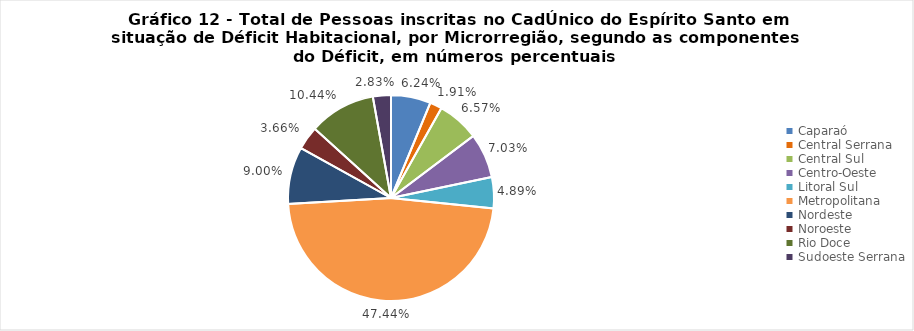
| Category | Series 0 |
|---|---|
| Caparaó | 0.062 |
| Central Serrana | 0.019 |
| Central Sul | 0.066 |
| Centro-Oeste | 0.07 |
| Litoral Sul | 0.049 |
| Metropolitana | 0.474 |
| Nordeste | 0.09 |
| Noroeste | 0.037 |
| Rio Doce | 0.104 |
| Sudoeste Serrana | 0.028 |